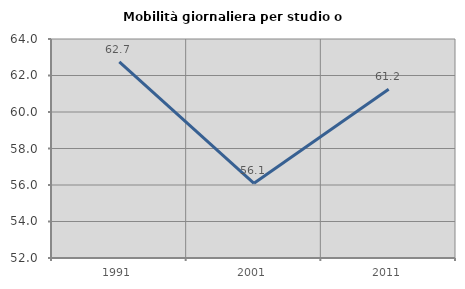
| Category | Mobilità giornaliera per studio o lavoro |
|---|---|
| 1991.0 | 62.745 |
| 2001.0 | 56.091 |
| 2011.0 | 61.247 |